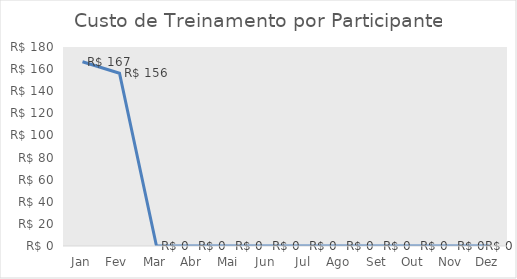
| Category | Custo de Treinamento por Participante |
|---|---|
| Jan | 166.667 |
| Fev | 156.25 |
| Mar | 0 |
| Abr | 0 |
| Mai | 0 |
| Jun | 0 |
| Jul | 0 |
| Ago | 0 |
| Set | 0 |
| Out | 0 |
| Nov | 0 |
| Dez | 0 |